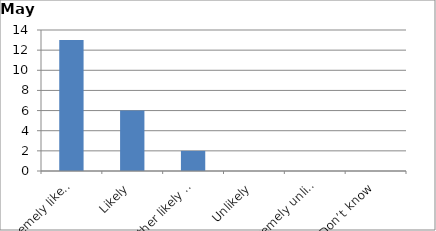
| Category | Series 0 |
|---|---|
| Extremely likely | 13 |
| Likely | 6 |
| Neither likely nor unlikely | 2 |
| Unlikely | 0 |
| Extremely unlikely | 0 |
| Don’t know | 0 |